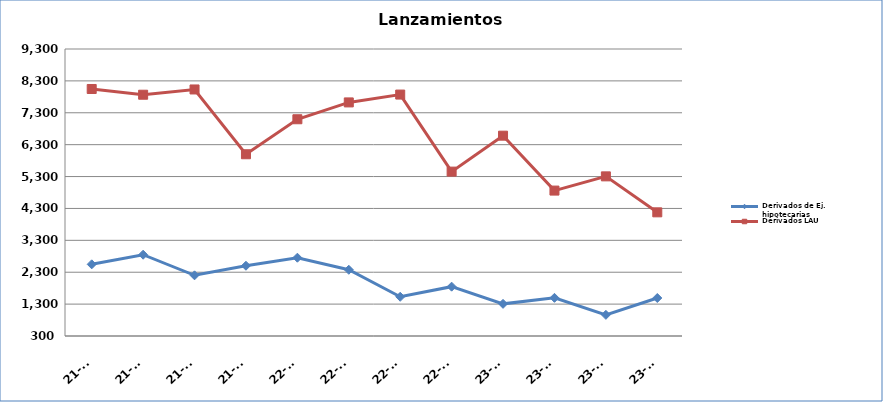
| Category | Derivados de Ej. hipotecarias | Derivados LAU |
|---|---|---|
| 21-T1 | 2548 | 8046 |
| 21-T2 | 2849 | 7866 |
| 21-T3 | 2203 | 8031 |
| 21-T4 | 2503 | 5999 |
| 22-T1 | 2755 | 7097 |
| 22-T2 | 2377 | 7625 |
| 22-T3 | 1530 | 7871 |
| 22-T4 | 1847 | 5455 |
| 23-T1 | 1308 | 6582 |
| 23-T2 | 1497 | 4860 |
| 23-T3 | 963 | 5306 |
| 23-T4 | 1492 | 4178 |